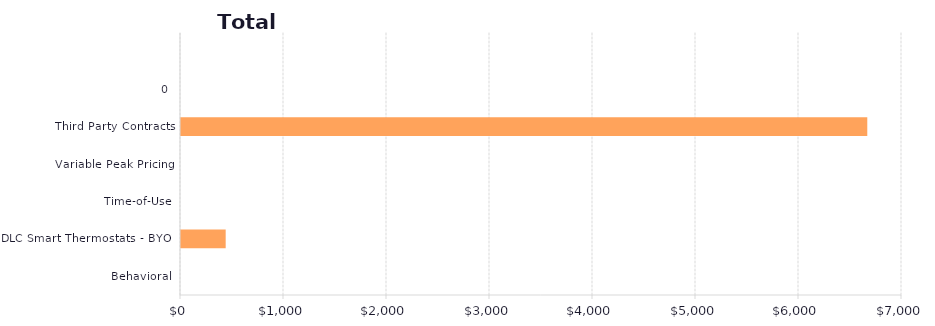
| Category | Series 1 |
|---|---|
| Behavioral | 0 |
| DLC Smart Thermostats - BYOT | 433.795 |
| Time-of-Use | 0 |
| Variable Peak Pricing | 0 |
| Third Party Contracts | 6662.96 |
| 0 | 0 |